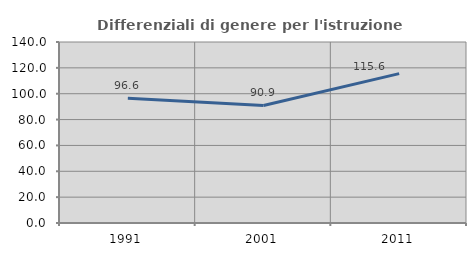
| Category | Differenziali di genere per l'istruzione superiore |
|---|---|
| 1991.0 | 96.562 |
| 2001.0 | 90.884 |
| 2011.0 | 115.564 |